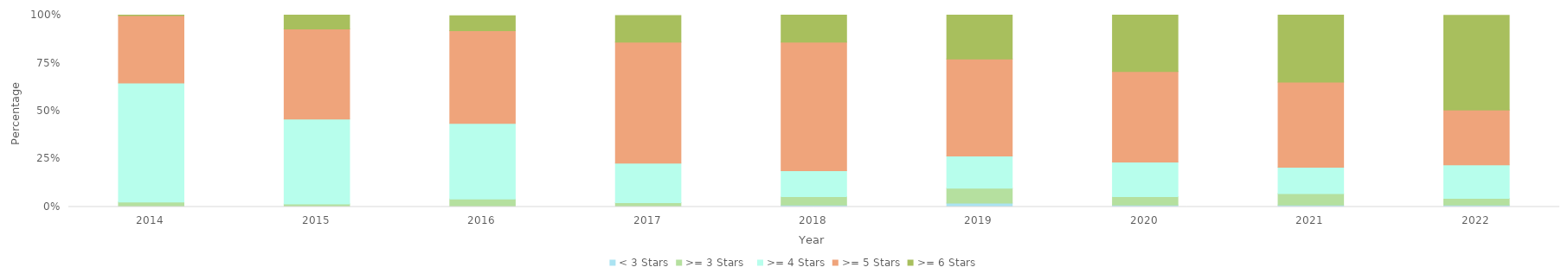
| Category | < 3 Stars | >= 3 Stars   | >= 4 Stars | >= 5 Stars | >= 6 Stars |
|---|---|---|---|---|---|
| 2014.0 | 0 | 0.026 | 0.621 | 0.351 | 0.001 |
| 2015.0 | 0 | 0.016 | 0.443 | 0.469 | 0.072 |
| 2016.0 | 0 | 0.041 | 0.394 | 0.484 | 0.078 |
| 2017.0 | 0 | 0.023 | 0.205 | 0.631 | 0.138 |
| 2018.0 | 0.01 | 0.044 | 0.134 | 0.67 | 0.143 |
| 2019.0 | 0.02 | 0.078 | 0.167 | 0.506 | 0.23 |
| 2020.0 | 0.01 | 0.045 | 0.18 | 0.472 | 0.294 |
| 2021.0 | 0.01 | 0.059 | 0.137 | 0.445 | 0.352 |
| 2022.0 | 0.01 | 0.035 | 0.174 | 0.287 | 0.493 |